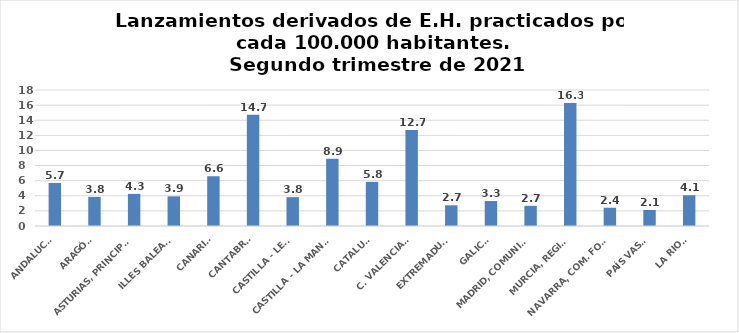
| Category | Series 0 |
|---|---|
| ANDALUCÍA | 5.698 |
| ARAGÓN | 3.848 |
| ASTURIAS, PRINCIPADO | 4.251 |
| ILLES BALEARS | 3.924 |
| CANARIAS | 6.586 |
| CANTABRIA | 14.718 |
| CASTILLA - LEÓN | 3.821 |
| CASTILLA - LA MANCHA | 8.888 |
| CATALUÑA | 5.84 |
| C. VALENCIANA | 12.695 |
| EXTREMADURA | 2.739 |
| GALICIA | 3.303 |
| MADRID, COMUNIDAD | 2.668 |
| MURCIA, REGIÓN | 16.272 |
| NAVARRA, COM. FORAL | 2.42 |
| PAÍS VASCO | 2.124 |
| LA RIOJA | 4.072 |